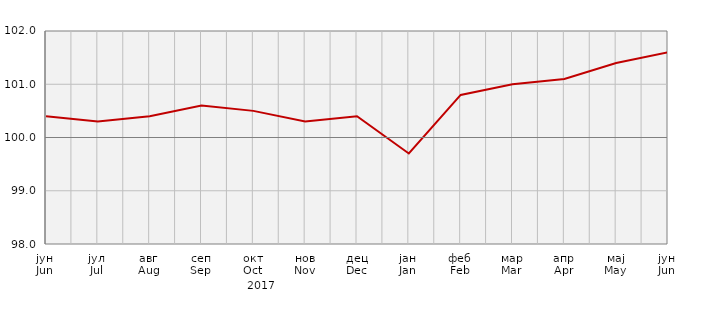
| Category | Индекси потрошачких цијена
Consumer price indices |
|---|---|
| јун
Jun | 100.4 |
| јул
Jul | 100.3 |
| авг
Aug | 100.4 |
| сеп
Sep | 100.6 |
| окт
Oct | 100.5 |
| нов
Nov | 100.3 |
| дец
Dec | 100.4 |
| јан
Jan | 99.7 |
| феб
Feb | 100.8 |
| мар
Mar | 101 |
| апр
Apr | 101.1 |
| мај
May | 101.4 |
| јун
Jun | 101.6 |